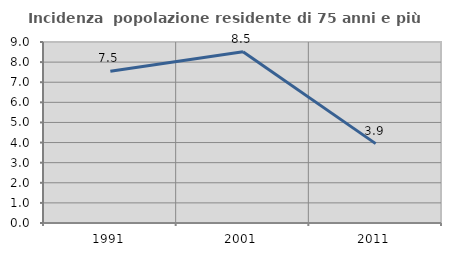
| Category | Incidenza  popolazione residente di 75 anni e più |
|---|---|
| 1991.0 | 7.547 |
| 2001.0 | 8.511 |
| 2011.0 | 3.947 |